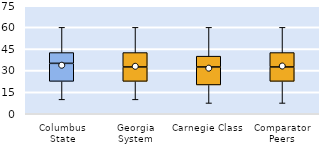
| Category | 25th | 50th | 75th |
|---|---|---|---|
| Columbus State | 22.5 | 12.5 | 7.5 |
| Georgia System | 22.5 | 10 | 10 |
| Carnegie Class | 20 | 12.5 | 7.5 |
| Comparator Peers | 22.5 | 10 | 10 |